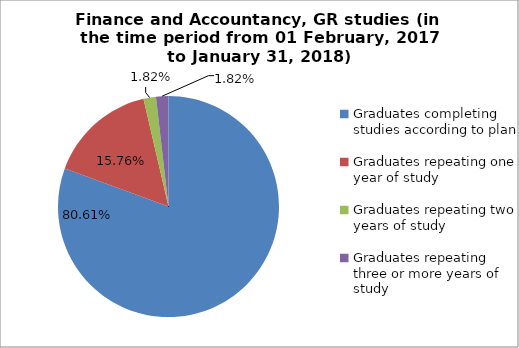
| Category | Series 0 |
|---|---|
| Graduates completing studies according to plan | 80.606 |
| Graduates repeating one year of study | 15.758 |
| Graduates repeating two years of study | 1.818 |
| Graduates repeating three or more years of study | 1.818 |